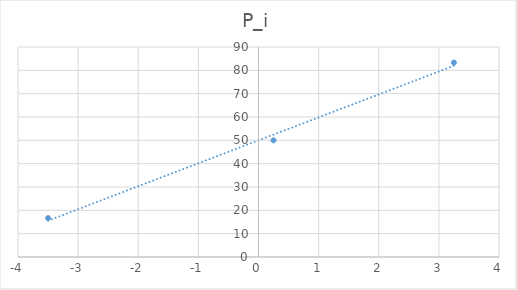
| Category | P_i |
|---|---|
| -3.5 | 16.667 |
| 0.25 | 50 |
| 3.25 | 83.333 |